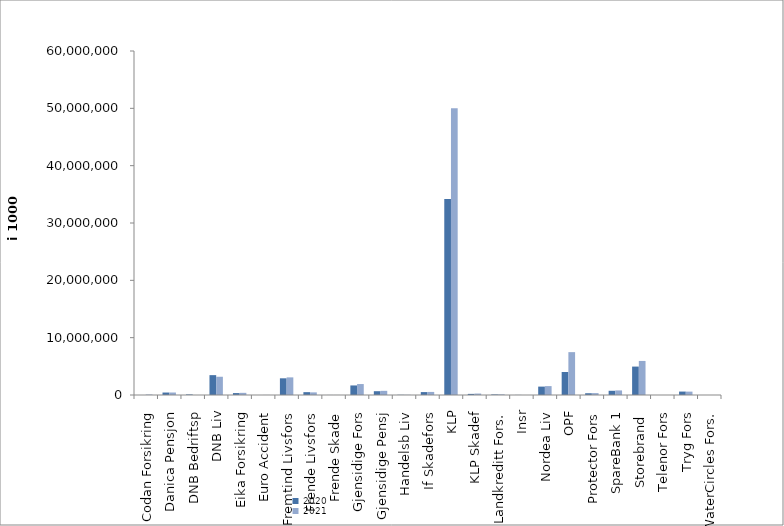
| Category | 2020 | 2021 |
|---|---|---|
| Codan Forsikring | 0 | 82704 |
| Danica Pensjon | 430556.189 | 434013.95 |
| DNB Bedriftsp | 98726 | 0 |
| DNB Liv | 3463853.922 | 3182644.288 |
| Eika Forsikring | 335372 | 375779 |
| Euro Accident | 0 | 10960 |
| Fremtind Livsfors | 2912282.942 | 3074791.831 |
| Frende Livsfors | 496774 | 458515 |
| Frende Skade | 6351.564 | 7999.02 |
| Gjensidige Fors | 1666418 | 1910669.164 |
| Gjensidige Pensj | 662338 | 726294 |
| Handelsb Liv | 34452.758 | 34165.242 |
| If Skadefors | 508488.738 | 535456.72 |
| KLP | 34177241.88 | 50026045.508 |
| KLP Skadef | 194718 | 253776.878 |
| Landkreditt Fors. | 98068 | 112320 |
| Insr | 14663 | 0 |
| Nordea Liv | 1464010.08 | 1552615 |
| OPF | 4017000 | 7476722 |
| Protector Fors | 307752.039 | 331132.553 |
| SpareBank 1 | 735170.289 | 799976.188 |
| Storebrand  | 4956525.376 | 5938754.061 |
| Telenor Fors | 1726 | 1344 |
| Tryg Fors | 598971.115 | 589319.004 |
| WaterCircles Fors. | 1278 | 1909 |